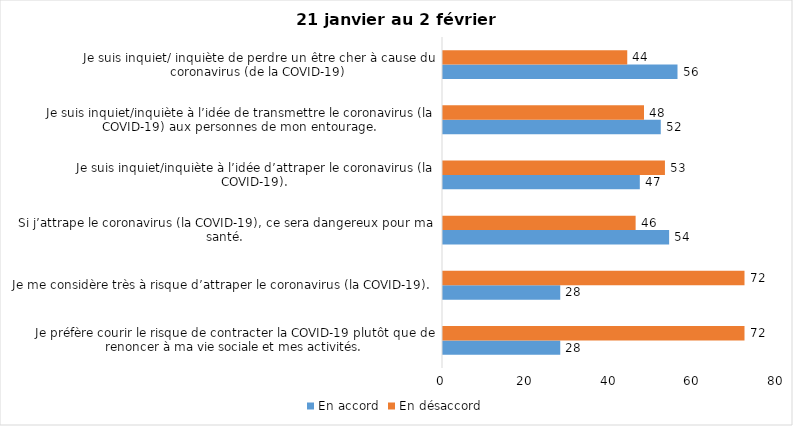
| Category | En accord | En désaccord |
|---|---|---|
| Je préfère courir le risque de contracter la COVID-19 plutôt que de renoncer à ma vie sociale et mes activités. | 28 | 72 |
| Je me considère très à risque d’attraper le coronavirus (la COVID-19). | 28 | 72 |
| Si j’attrape le coronavirus (la COVID-19), ce sera dangereux pour ma santé. | 54 | 46 |
| Je suis inquiet/inquiète à l’idée d’attraper le coronavirus (la COVID-19). | 47 | 53 |
| Je suis inquiet/inquiète à l’idée de transmettre le coronavirus (la COVID-19) aux personnes de mon entourage. | 52 | 48 |
| Je suis inquiet/ inquiète de perdre un être cher à cause du coronavirus (de la COVID-19) | 56 | 44 |